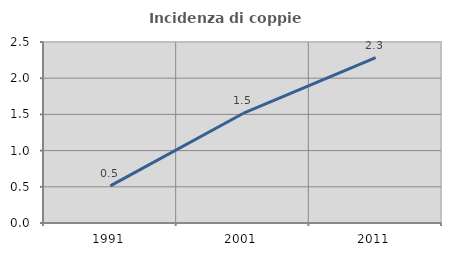
| Category | Incidenza di coppie miste |
|---|---|
| 1991.0 | 0.512 |
| 2001.0 | 1.513 |
| 2011.0 | 2.284 |